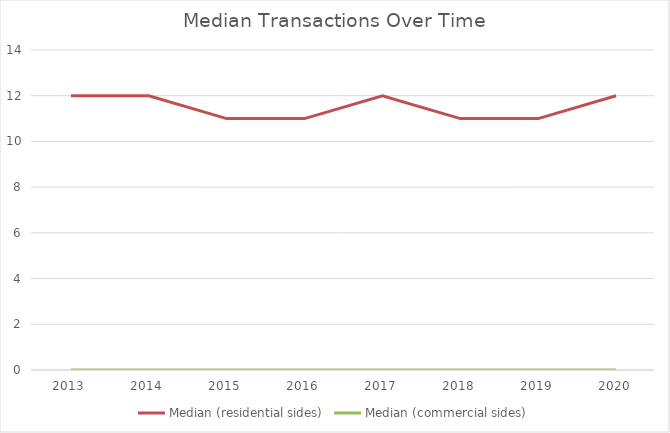
| Category | Median (residential sides) | Median (commercial sides) |
|---|---|---|
| 2013.0 | 12 | 0 |
| 2014.0 | 12 | 0 |
| 2015.0 | 11 | 0 |
| 2016.0 | 11 | 0 |
| 2017.0 | 12 | 0 |
| 2018.0 | 11 | 0 |
| 2019.0 | 11 | 0 |
| 2020.0 | 12 | 0 |